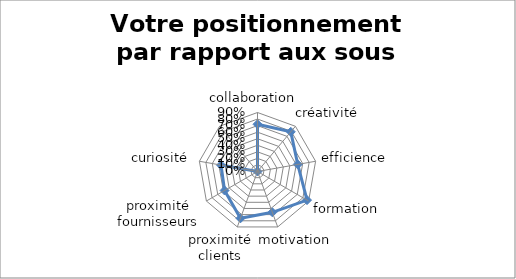
| Category | Series 0 |
|---|---|
| collaboration  | 0.721 |
| créativité | 0.79 |
| efficience | 0.623 |
| formation | 0.872 |
| motivation | 0.663 |
| proximité clients | 0.76 |
| proximité fournisseurs | 0.58 |
| curiosité | 0.565 |